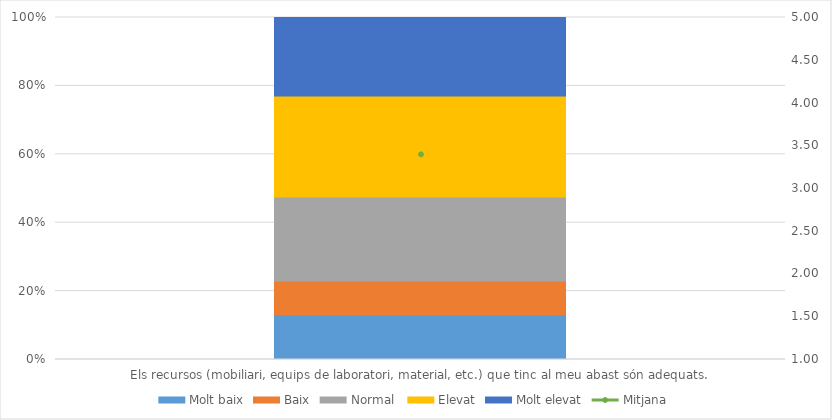
| Category | Molt baix | Baix | Normal  | Elevat | Molt elevat |
|---|---|---|---|---|---|
| Els recursos (mobiliari, equips de laboratori, material, etc.) que tinc al meu abast són adequats. | 8 | 6 | 15 | 18 | 14 |